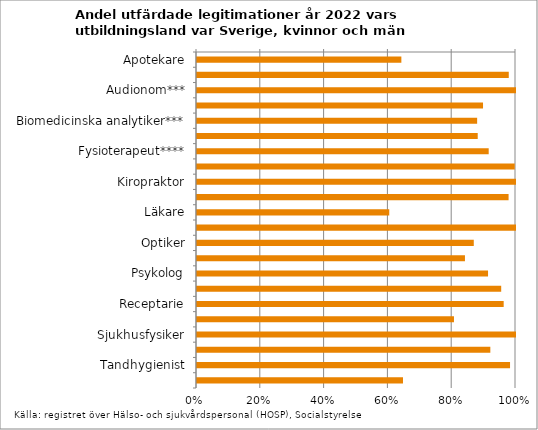
| Category | Series 0 |
|---|---|
| Apotekare | 0.641 |
| Arbetsterapeut | 0.977 |
| Audionom*** | 1 |
| Barnmorska | 0.897 |
| Biomedicinska analytiker*** | 0.878 |
| Dietist*** | 0.88 |
| Fysioterapeut**** | 0.914 |
| Hälso- och sjukvårdskurator*** | 0.996 |
| Kiropraktor | 1 |
| Logoped | 0.977 |
| Läkare | 0.603 |
| Naprapat | 1 |
| Optiker | 0.868 |
| Ortopedingenjör*** | 0.84 |
| Psykolog | 0.912 |
| Psykoterapeut | 0.954 |
| Receptarie | 0.961 |
| Röntgensjuksköterska*** | 0.806 |
| Sjukhusfysiker | 1 |
| Sjuksköterska | 0.92 |
| Tandhygienist | 0.981 |
| Tandläkare | 0.646 |